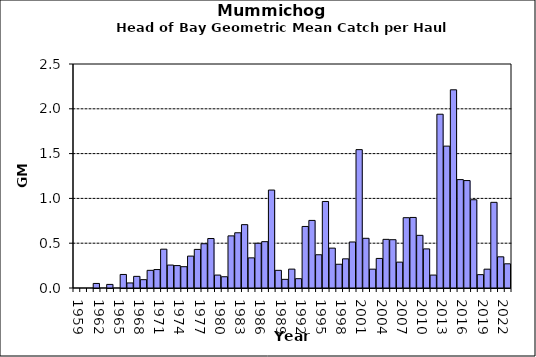
| Category | Series 0 |
|---|---|
| 1959.0 | 0 |
| 1960.0 | 0 |
| 1961.0 | 0 |
| 1962.0 | 0.051 |
| 1963.0 | 0 |
| 1964.0 | 0.04 |
| 1965.0 | 0 |
| 1966.0 | 0.151 |
| 1967.0 | 0.056 |
| 1968.0 | 0.13 |
| 1969.0 | 0.093 |
| 1970.0 | 0.197 |
| 1971.0 | 0.206 |
| 1972.0 | 0.433 |
| 1973.0 | 0.256 |
| 1974.0 | 0.25 |
| 1975.0 | 0.238 |
| 1976.0 | 0.356 |
| 1977.0 | 0.431 |
| 1978.0 | 0.494 |
| 1979.0 | 0.552 |
| 1980.0 | 0.144 |
| 1981.0 | 0.126 |
| 1982.0 | 0.582 |
| 1983.0 | 0.616 |
| 1984.0 | 0.707 |
| 1985.0 | 0.336 |
| 1986.0 | 0.499 |
| 1987.0 | 0.517 |
| 1988.0 | 1.093 |
| 1989.0 | 0.197 |
| 1990.0 | 0.097 |
| 1991.0 | 0.211 |
| 1992.0 | 0.104 |
| 1993.0 | 0.687 |
| 1994.0 | 0.754 |
| 1995.0 | 0.371 |
| 1996.0 | 0.966 |
| 1997.0 | 0.445 |
| 1998.0 | 0.265 |
| 1999.0 | 0.326 |
| 2000.0 | 0.514 |
| 2001.0 | 1.544 |
| 2002.0 | 0.555 |
| 2003.0 | 0.21 |
| 2004.0 | 0.33 |
| 2005.0 | 0.543 |
| 2006.0 | 0.539 |
| 2007.0 | 0.289 |
| 2008.0 | 0.785 |
| 2009.0 | 0.788 |
| 2010.0 | 0.588 |
| 2011.0 | 0.436 |
| 2012.0 | 0.144 |
| 2013.0 | 1.939 |
| 2014.0 | 1.583 |
| 2015.0 | 2.212 |
| 2016.0 | 1.21 |
| 2017.0 | 1.199 |
| 2018.0 | 0.985 |
| 2019.0 | 0.149 |
| 2020.0 | 0.21 |
| 2021.0 | 0.956 |
| 2022.0 | 0.348 |
| 2023.0 | 0.27 |